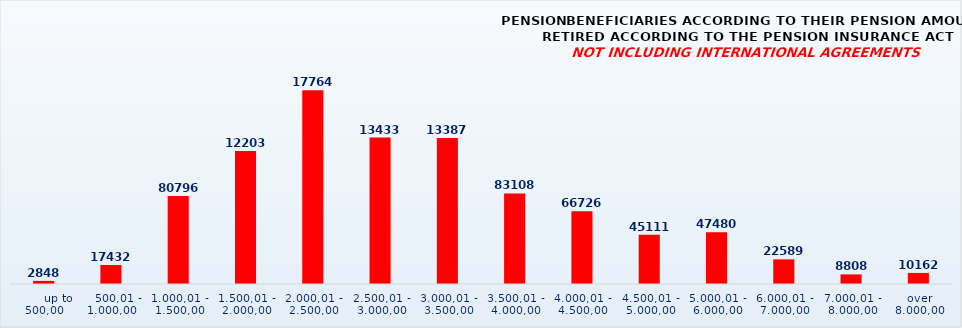
| Category | PENSION BENEFICIARIES ACCORDING TO TYPES AND AMOUNTS OF PENSION, RETIRED ACCORDING TO THE PENSION INSURANCE ACT
NOT INCLUDING INTERNATIONAL AGREEMENTS |
|---|---|
|       up to 500,00 | 2848 |
|    500,01 - 1.000,00 | 17432 |
| 1.000,01 - 1.500,00 | 80796 |
| 1.500,01 - 2.000,00 | 122033 |
| 2.000,01 - 2.500,00 | 177649 |
| 2.500,01 - 3.000,00 | 134330 |
| 3.000,01 - 3.500,00 | 133878 |
| 3.500,01 - 4.000,00 | 83108 |
| 4.000,01 - 4.500,00 | 66726 |
| 4.500,01 - 5.000,00 | 45111 |
| 5.000,01 - 6.000,00 | 47480 |
| 6.000,01 - 7.000,00 | 22589 |
| 7.000,01 - 8.000,00 | 8808 |
|  over  8.000,00 | 10162 |